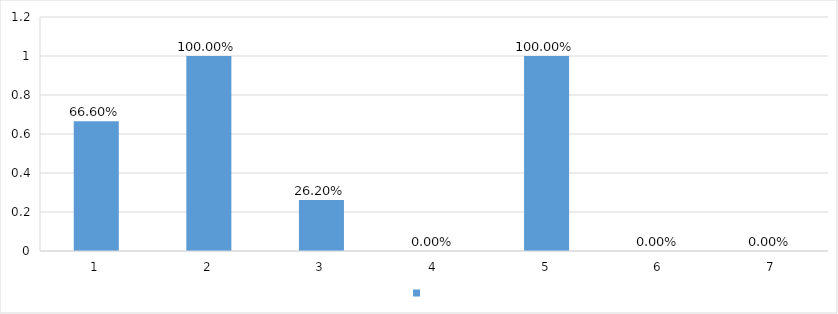
| Category | Series 0 |
|---|---|
| 1 | 0.666 |
| 2 | 1 |
| 3 | 0.262 |
| 4 | 0 |
| 5 | 1 |
| 6 | 0 |
| 7 | 0 |